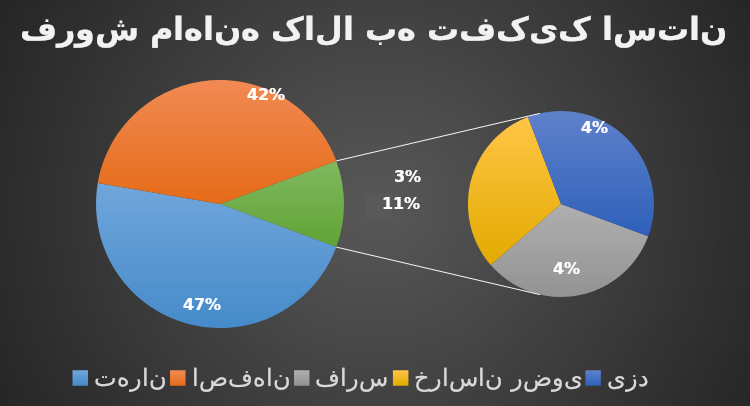
| Category | فروش |
|---|---|
| تهران | 9600000 |
| اصفهان | 8500000 |
| فارس | 760000 |
| خراسان رضوی | 705000 |
| یزد | 840000 |